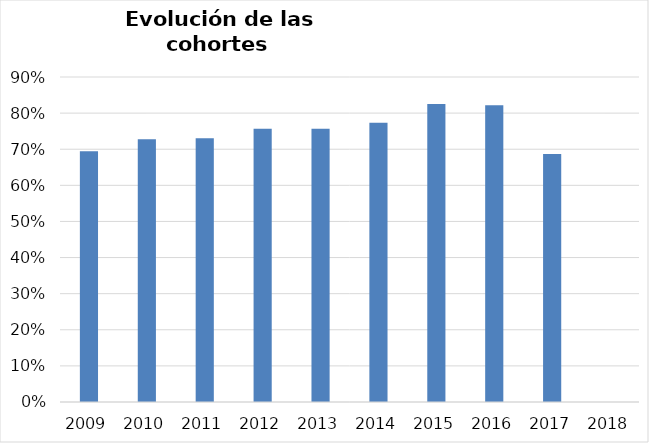
| Category | Series 0 |
|---|---|
| 2009.0 | 0.694 |
| 2010.0 | 0.728 |
| 2011.0 | 0.73 |
| 2012.0 | 0.757 |
| 2013.0 | 0.757 |
| 2014.0 | 0.773 |
| 2015.0 | 0.825 |
| 2016.0 | 0.822 |
| 2017.0 | 0.687 |
| 2018.0 | 0 |